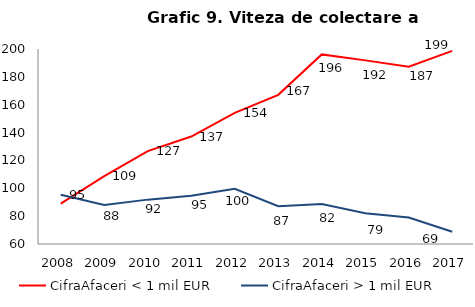
| Category | CifraAfaceri < 1 mil EUR | CifraAfaceri > 1 mil EUR |
|---|---|---|
| 2008.0 | 88.929 | 95.359 |
| 2009.0 | 108.759 | 88.059 |
| 2010.0 | 126.676 | 91.855 |
| 2011.0 | 137.147 | 94.715 |
| 2012.0 | 154.101 | 99.666 |
| 2013.0 | 167.116 | 87.182 |
| 2014.0 | 196.125 | 88.665 |
| 2015.0 | 191.828 | 82.087 |
| 2016.0 | 187.262 | 79.014 |
| 2017.0 | 198.611 | 68.839 |